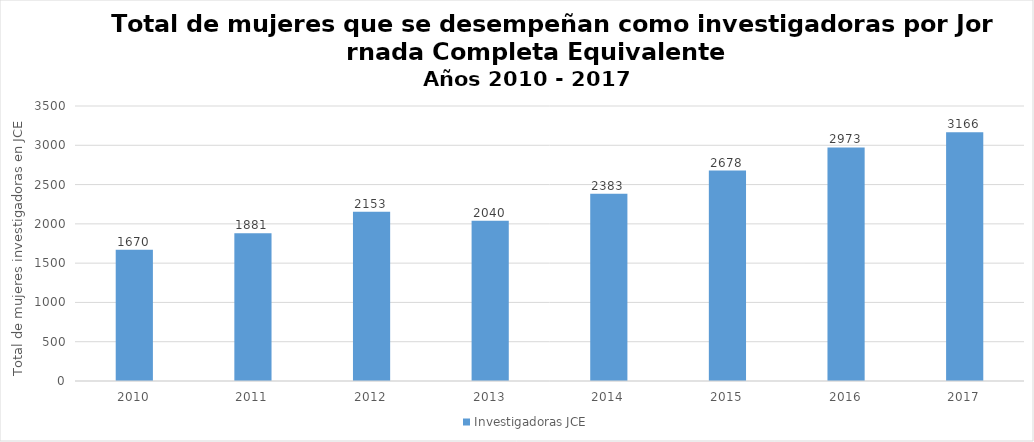
| Category | Investigadoras JCE  |
|---|---|
| 2010.0 | 1670 |
| 2011.0 | 1881 |
| 2012.0 | 2153 |
| 2013.0 | 2040 |
| 2014.0 | 2383 |
| 2015.0 | 2678 |
| 2016.0 | 2973 |
| 2017.0 | 3166 |